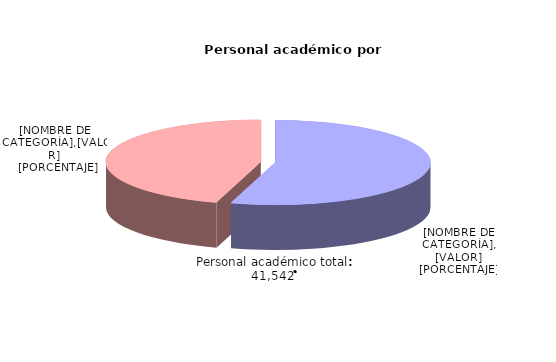
| Category | Series 0 | Series 1 |
|---|---|---|
|  Hombres  | 22691 | 54.622 |
|  Mujeres  | 18851 | 45.378 |